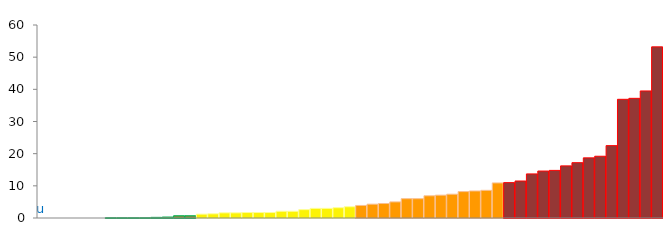
| Category | Top Quartile | 2nd Quartile | 3rd Quartile | Bottom Quartile | Series 4 |
|---|---|---|---|---|---|
| u | 0 | 0 | 0 | 0 | 0 |